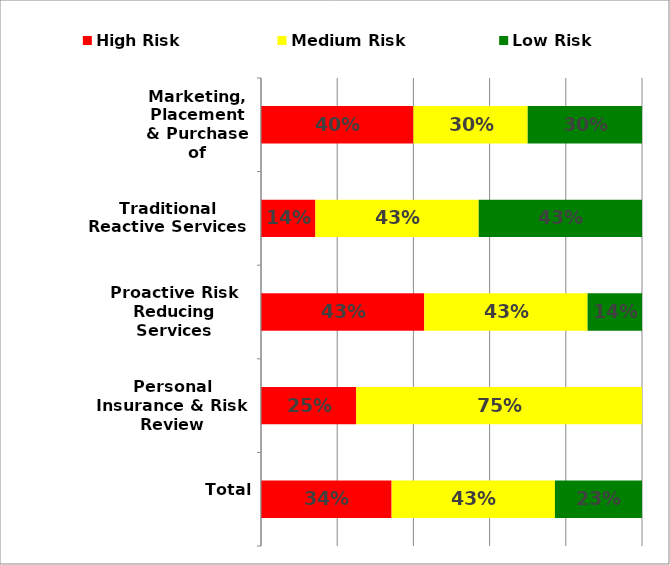
| Category | High Risk | Medium Risk | Low Risk |
|---|---|---|---|
| Total | 0.343 | 0.429 | 0.229 |
| Personal Insurance & Risk Review | 0.25 | 0.75 | 0 |
| Proactive Risk Reducing Services | 0.429 | 0.429 | 0.143 |
| Traditional Reactive Services | 0.143 | 0.429 | 0.429 |
| Marketing, Placement & Purchase of Insurance | 0.4 | 0.3 | 0.3 |